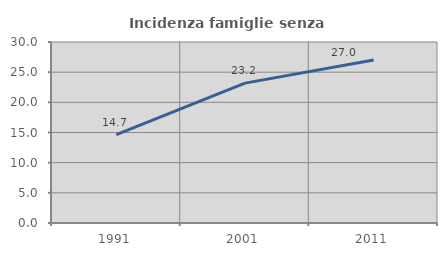
| Category | Incidenza famiglie senza nuclei |
|---|---|
| 1991.0 | 14.657 |
| 2001.0 | 23.183 |
| 2011.0 | 27.032 |